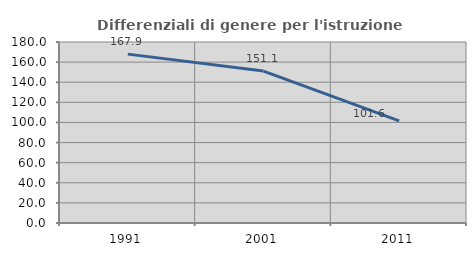
| Category | Differenziali di genere per l'istruzione superiore |
|---|---|
| 1991.0 | 167.949 |
| 2001.0 | 151.08 |
| 2011.0 | 101.623 |